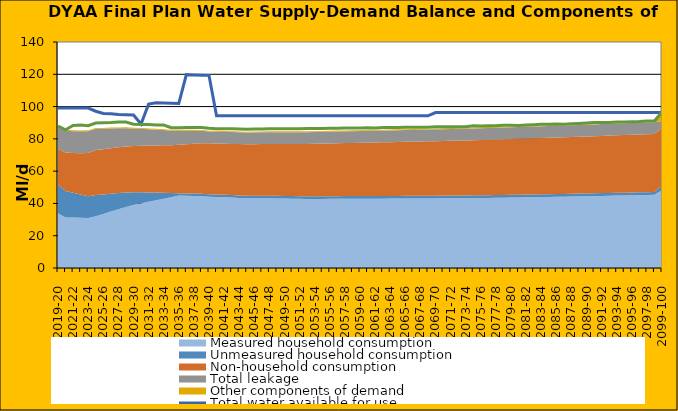
| Category | Total water available for use | Total demand + target headroom (final plan) |
|---|---|---|
| 0 | 99.1 | 87.985 |
| 1 | 99.1 | 85.588 |
| 2 | 99.1 | 88.256 |
| 3 | 99.1 | 88.557 |
| 4 | 99.1 | 88.168 |
| 5 | 97.1 | 89.807 |
| 6 | 95.768 | 90.041 |
| 7 | 95.62 | 90.08 |
| 8 | 95.112 | 90.499 |
| 9 | 94.964 | 90.425 |
| 10 | 94.816 | 89.056 |
| 11 | 89.158 | 88.956 |
| 12 | 101.51 | 88.866 |
| 13 | 102.363 | 88.577 |
| 14 | 102.215 | 88.538 |
| 15 | 102.067 | 86.903 |
| 16 | 101.919 | 86.872 |
| 17 | 119.771 | 86.968 |
| 18 | 119.623 | 87.022 |
| 19 | 119.475 | 87.001 |
| 20 | 119.327 | 86.508 |
| 21 | 94.29 | 86.307 |
| 22 | 94.29 | 86.275 |
| 23 | 94.29 | 86.287 |
| 24 | 94.29 | 86.106 |
| 25 | 94.29 | 85.971 |
| 26 | 94.29 | 86.154 |
| 27 | 94.29 | 86.14 |
| 28 | 94.29 | 86.199 |
| 29 | 94.29 | 86.281 |
| 30 | 94.29 | 86.242 |
| 31 | 94.29 | 86.3 |
| 32 | 94.29 | 86.27 |
| 33 | 94.29 | 86.363 |
| 34 | 94.29 | 86.391 |
| 35 | 94.29 | 86.391 |
| 36 | 94.29 | 86.559 |
| 37 | 94.29 | 86.573 |
| 38 | 94.29 | 86.652 |
| 39 | 94.29 | 86.67 |
| 40 | 94.29 | 86.687 |
| 41 | 94.29 | 86.806 |
| 42 | 94.29 | 86.725 |
| 43 | 94.29 | 86.999 |
| 44 | 94.29 | 87.032 |
| 45 | 94.29 | 87.098 |
| 46 | 94.29 | 87.162 |
| 47 | 94.29 | 87.185 |
| 48 | 94.29 | 87.246 |
| 49 | 94.29 | 87.222 |
| 50 | 96.29 | 87.463 |
| 51 | 96.29 | 87.468 |
| 52 | 96.29 | 87.452 |
| 53 | 96.29 | 87.443 |
| 54 | 96.29 | 87.495 |
| 55 | 96.29 | 88.159 |
| 56 | 96.29 | 87.948 |
| 57 | 96.29 | 88.043 |
| 58 | 96.29 | 88.087 |
| 59 | 96.29 | 88.411 |
| 60 | 96.29 | 88.407 |
| 61 | 96.29 | 88.345 |
| 62 | 96.29 | 88.582 |
| 63 | 96.29 | 88.78 |
| 64 | 96.29 | 89.06 |
| 65 | 96.29 | 88.994 |
| 66 | 96.29 | 89.173 |
| 67 | 96.29 | 89.105 |
| 68 | 96.29 | 89.393 |
| 69 | 96.29 | 89.588 |
| 70 | 96.29 | 89.837 |
| 71 | 96.29 | 90.136 |
| 72 | 96.29 | 90.153 |
| 73 | 96.29 | 90.175 |
| 74 | 96.29 | 90.475 |
| 75 | 96.29 | 90.459 |
| 76 | 96.29 | 90.659 |
| 77 | 96.29 | 90.685 |
| 78 | 96.29 | 90.996 |
| 79 | 96.29 | 91.073 |
| 80 | 96.29 | 96.715 |